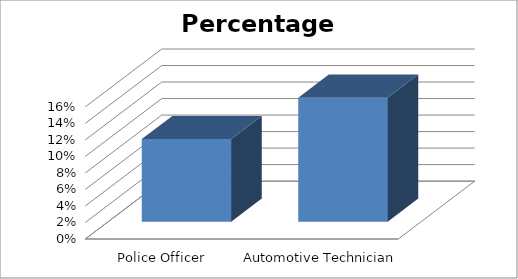
| Category | Percentage growth |
|---|---|
| Police Officer | 0.1 |
| Automotive Technician | 0.15 |